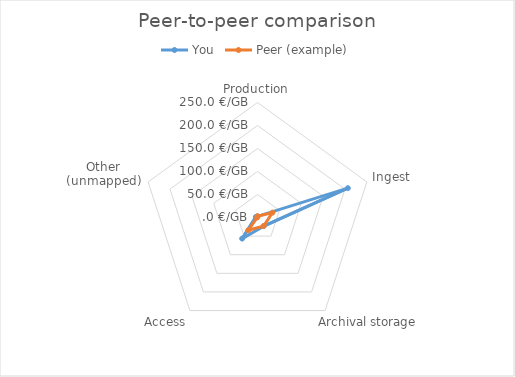
| Category | You | Peer (example) |
|---|---|---|
| Production | 2.456 | 2.69 |
| Ingest | 206.491 | 34.11 |
| Archival storage  | 23.093 | 22.88 |
| Access | 56.725 | 34.11 |
| Other (unmapped) | 3.813 | 0.61 |